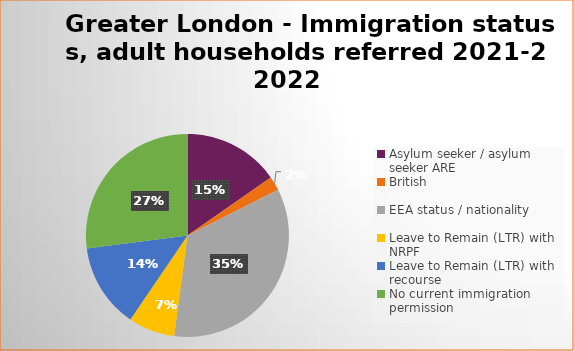
| Category | Number  | Percentage |
|---|---|---|
| Asylum seeker / asylum seeker ARE | 157 | 0.153 |
| British | 23 | 0.022 |
| EEA status / nationality  | 354 | 0.345 |
| Leave to Remain (LTR) with NRPF | 76 | 0.074 |
| Leave to Remain (LTR) with recourse | 138 | 0.135 |
| No current immigration permission | 277 | 0.27 |